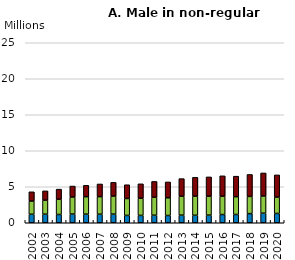
| Category | Under 25 | 25-60  | Over 60 |
|---|---|---|---|
| 2002.0 | 1.18 | 1.84 | 1.28 |
| 2003.0 | 1.19 | 1.95 | 1.29 |
| 2004.0 | 1.15 | 2.12 | 1.4 |
| 2005.0 | 1.21 | 2.37 | 1.52 |
| 2006.0 | 1.19 | 2.43 | 1.58 |
| 2007.0 | 1.19 | 2.44 | 1.76 |
| 2008.0 | 1.2 | 2.51 | 1.9 |
| 2009.0 | 1.02 | 2.35 | 1.91 |
| 2010.0 | 1.02 | 2.39 | 2 |
| 2011.0 | 1.05 | 2.5 | 2.19 |
| 2012.0 | 1.01 | 2.46 | 2.2 |
| 2013.0 | 1.06 | 2.63 | 2.44 |
| 2014.0 | 1.04 | 2.66 | 2.61 |
| 2015.0 | 1.06 | 2.63 | 2.68 |
| 2016.0 | 1.14 | 2.55 | 2.83 |
| 2017.0 | 1.15 | 2.47 | 2.85 |
| 2018.0 | 1.27 | 2.39 | 3.05 |
| 2019.0 | 1.33 | 2.39 | 3.2 |
| 2020.0 | 1.29 | 2.28 | 3.08 |